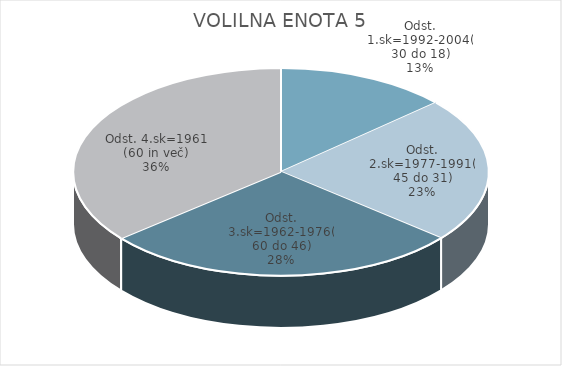
| Category | VOLILNA ENOTA 5 |
|---|---|
| Odst. 1.sk=1992-2004(30 do 18) | 9.41 |
| Odst. 2.sk=1977-1991(45 do 31) | 15.92 |
| Odst. 3.sk=1962-1976(60 do 46) | 19.63 |
| Odst. 4.sk=1961 (60 in več) | 25.35 |